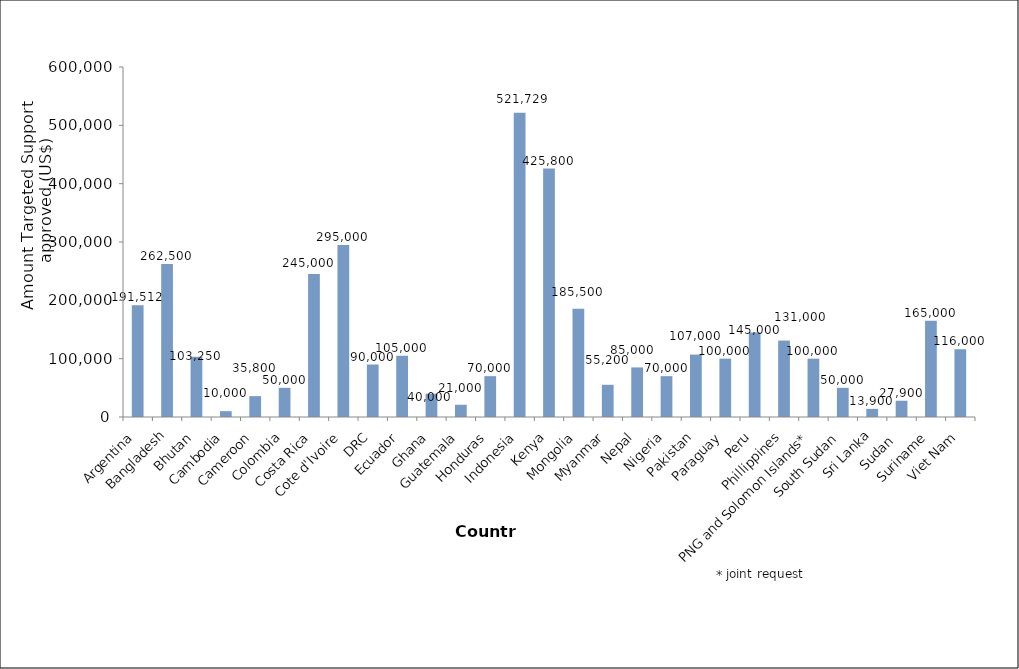
| Category | Series 0 |
|---|---|
| Argentina | 191512 |
| Bangladesh | 262500 |
| Bhutan | 103250 |
| Cambodia | 10000 |
| Cameroon | 35800 |
| Colombia | 50000 |
| Costa Rica | 245000 |
| Cote d'Ivoire  | 295000 |
| DRC | 90000 |
| Ecuador | 105000 |
| Ghana | 40000 |
| Guatemala | 21000 |
| Honduras | 70000 |
| Indonesia | 521729 |
| Kenya | 425800 |
| Mongolia | 185500 |
| Myanmar | 55200 |
| Nepal | 85000 |
| Nigeria | 70000 |
| Pakistan | 107000 |
| Paraguay | 100000 |
| Peru | 145000 |
| Phillippines | 131000 |
| PNG and Solomon Islands* | 100000 |
| South Sudan | 50000 |
| Sri Lanka | 13900 |
| Sudan  | 27900 |
| Suriname | 165000 |
| Viet Nam | 116000 |